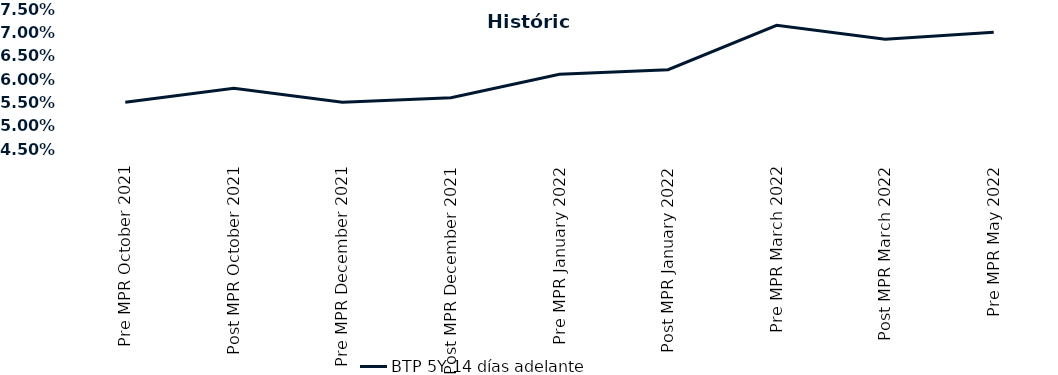
| Category | BTP 5Y 14 días adelante |
|---|---|
| Pre MPR October 2021 | 0.055 |
| Post MPR October 2021 | 0.058 |
| Pre MPR December 2021 | 0.055 |
| Post MPR December 2021 | 0.056 |
| Pre MPR January 2022 | 0.061 |
| Post MPR January 2022 | 0.062 |
| Pre MPR March 2022 | 0.072 |
| Post MPR March 2022 | 0.068 |
| Pre MPR May 2022 | 0.07 |